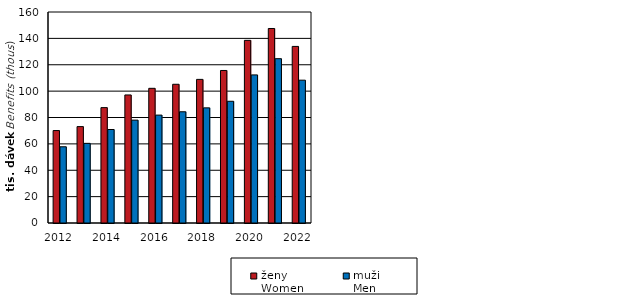
| Category | ženy  
Women | muži  
Men |
|---|---|---|
| 2012.0 | 70.1 | 57.8 |
| 2013.0 | 73.1 | 60.4 |
| 2014.0 | 87.5 | 70.9 |
| 2015.0 | 97.1 | 78 |
| 2016.0 | 102.128 | 81.818 |
| 2017.0 | 105.196 | 84.343 |
| 2018.0 | 108.904 | 87.321 |
| 2019.0 | 115.66 | 92.304 |
| 2020.0 | 138.5 | 112.3 |
| 2021.0 | 147.5 | 124.6 |
| 2022.0 | 133.9 | 108.3 |